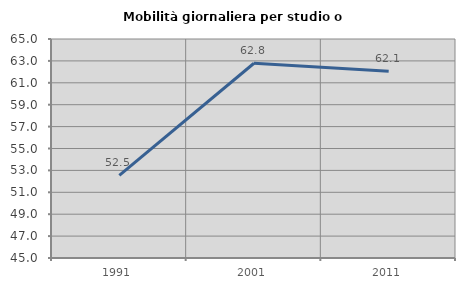
| Category | Mobilità giornaliera per studio o lavoro |
|---|---|
| 1991.0 | 52.539 |
| 2001.0 | 62.787 |
| 2011.0 | 62.05 |